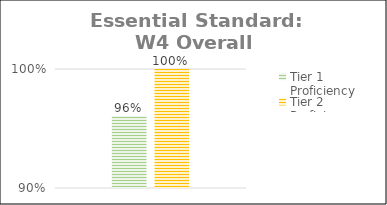
| Category | Tier 1 Proficiency | Tier 2 Proficiency |
|---|---|---|
| Total Class | 0.961 | 1 |